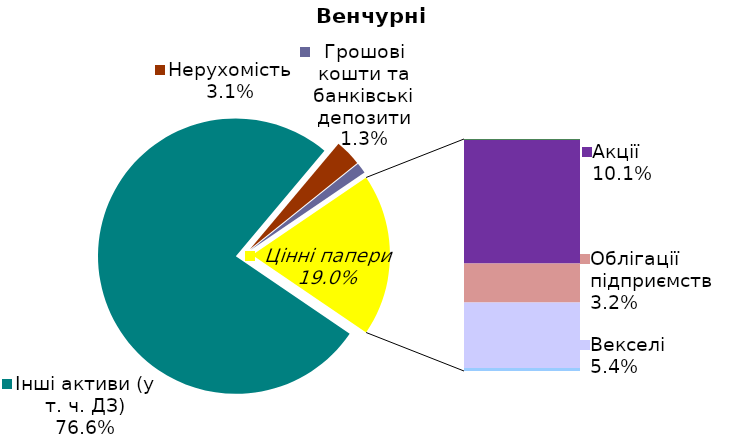
| Category | Series 0 |
|---|---|
| Інші активи (у т. ч. ДЗ) | 0.766 |
| Нерухомість | 0.031 |
| Грошові кошти та банківські депозити | 0.013 |
| Банківські метали | 0 |
| Облігації державні  | 0.001 |
| Акції | 0.101 |
| Облігації підприємств | 0.032 |
| Векселі | 0.054 |
| Заставні | 0 |
| Інші ЦП | 0.002 |